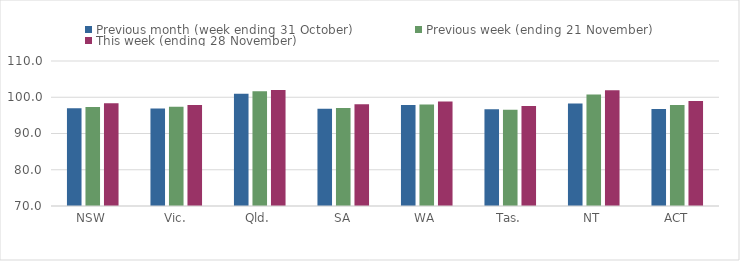
| Category | Previous month (week ending 31 October) | Previous week (ending 21 November) | This week (ending 28 November) |
|---|---|---|---|
| NSW | 96.98 | 97.3 | 98.35 |
| Vic. | 96.87 | 97.35 | 97.87 |
| Qld. | 100.97 | 101.66 | 101.97 |
| SA | 96.85 | 97.01 | 98.09 |
| WA | 97.89 | 97.98 | 98.8 |
| Tas. | 96.67 | 96.55 | 97.62 |
| NT | 98.25 | 100.77 | 101.95 |
| ACT | 96.77 | 97.83 | 98.99 |